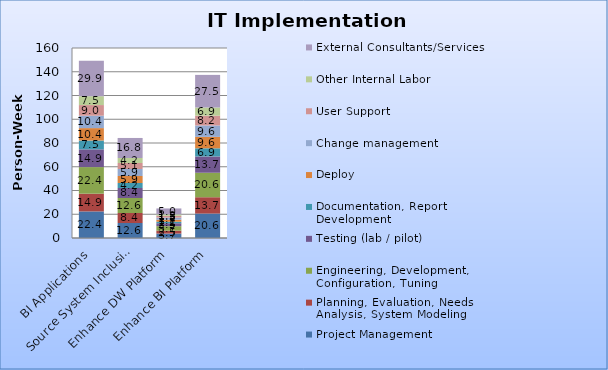
| Category | Project Management | Planning, Evaluation, Needs Analysis, System Modeling | Engineering, Development, Configuration, Tuning | Testing (lab / pilot) | Documentation, Report Development | Deploy | Change management | User Support | Other Internal Labor | External Consultants/Services |
|---|---|---|---|---|---|---|---|---|---|---|
| BI Applications | 22.389 | 14.926 | 22.389 | 14.926 | 7.463 | 10.448 | 10.448 | 8.956 | 7.463 | 29.853 |
| Source System Inclusion / Integration | 12.636 | 8.424 | 12.636 | 8.424 | 4.212 | 5.897 | 5.897 | 5.054 | 4.212 | 16.848 |
| Enhance DW Platform | 3.734 | 2.489 | 3.734 | 2.489 | 1.245 | 1.743 | 1.743 | 1.494 | 1.245 | 4.979 |
| Enhance BI Platform | 20.603 | 13.736 | 20.603 | 13.736 | 6.868 | 9.615 | 9.615 | 8.241 | 6.868 | 27.471 |